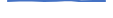
| Category | Series 0 |
|---|---|
| 0 | 11 |
| 1 | 14 |
| 2 | 14 |
| 3 | 11 |
| 4 | 13 |
| 5 | 19 |
| 6 | 8 |
| 7 | 9 |
| 8 | 10 |